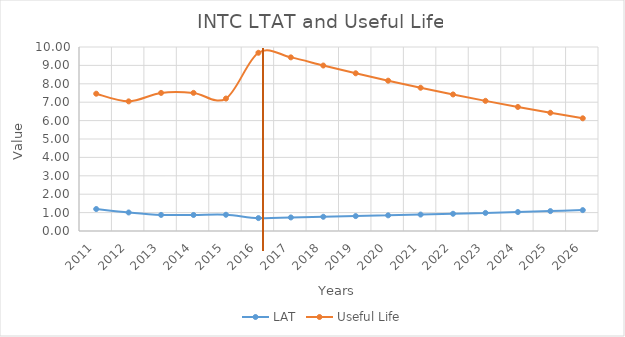
| Category | LAT | Useful Life |
|---|---|---|
| 2011 | 1.193 | 7.462 |
| 2012 | 1.007 | 7.045 |
| 2013 | 0.874 | 7.504 |
| 2014 | 0.871 | 7.506 |
| 2015 | 0.883 | 7.199 |
| 2016 | 0.702 | 9.686 |
| 2017 | 0.737 | 9.437 |
| 2018 | 0.773 | 8.994 |
| 2019 | 0.811 | 8.571 |
| 2020 | 0.851 | 8.169 |
| 2021 | 0.893 | 7.786 |
| 2022 | 0.937 | 7.421 |
| 2023 | 0.983 | 7.073 |
| 2024 | 1.031 | 6.741 |
| 2025 | 1.082 | 6.426 |
| 2026 | 1.135 | 6.125 |